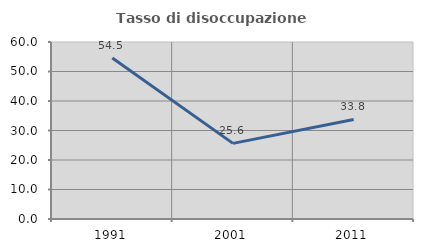
| Category | Tasso di disoccupazione giovanile  |
|---|---|
| 1991.0 | 54.545 |
| 2001.0 | 25.641 |
| 2011.0 | 33.75 |